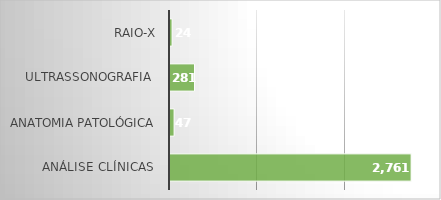
| Category | Series 0 |
|---|---|
| Análise Clínicas  | 2761 |
| Anatomia Patológica | 47 |
| Ultrassonografia  | 281 |
| RAIO-X | 24 |